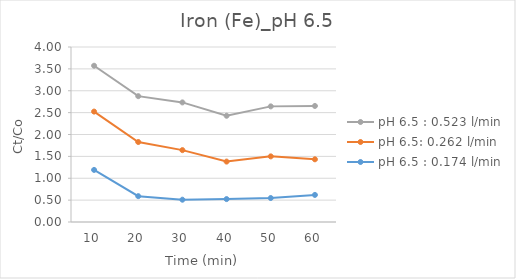
| Category | pH 6.5 : 0.174 l/min | pH 6.5: 0.262 l/min | pH 6.5 : 0.523 l/min |
|---|---|---|---|
| 10.0 | 1.19 | 1.333 | 1.048 |
| 20.0 | 0.59 | 1.238 | 1.048 |
| 30.0 | 0.51 | 1.133 | 1.09 |
| 40.0 | 0.524 | 0.857 | 1.048 |
| 50.0 | 0.548 | 0.952 | 1.143 |
| 60.0 | 0.619 | 0.814 | 1.219 |